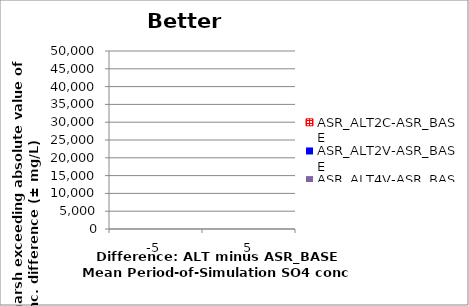
| Category | ASR_ALT2C-ASR_BASE | ASR_ALT2V-ASR_BASE | ASR_ALT4V-ASR_BASE |
|---|---|---|---|
| -5.0 | 0 | 0 | 0 |
| 5.0 | 0 | 0 | 0 |